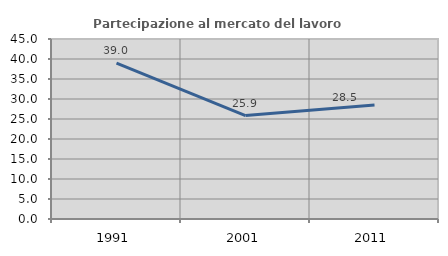
| Category | Partecipazione al mercato del lavoro  femminile |
|---|---|
| 1991.0 | 38.967 |
| 2001.0 | 25.862 |
| 2011.0 | 28.522 |